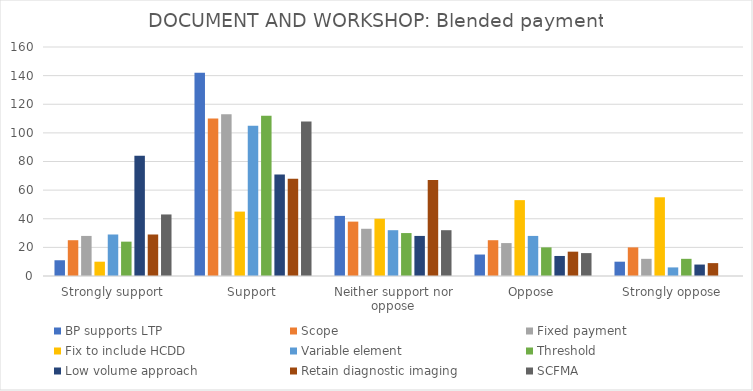
| Category | BP supports LTP | Scope | Fixed payment | Fix to include HCDD | Variable element | Threshold | Low volume approach | Retain diagnostic imaging | SCFMA |
|---|---|---|---|---|---|---|---|---|---|
| Strongly support | 11 | 25 | 28 | 10 | 29 | 24 | 84 | 29 | 43 |
| Support | 142 | 110 | 113 | 45 | 105 | 112 | 71 | 68 | 108 |
| Neither support nor oppose | 42 | 38 | 33 | 40 | 32 | 30 | 28 | 67 | 32 |
| Oppose | 15 | 25 | 23 | 53 | 28 | 20 | 14 | 17 | 16 |
| Strongly oppose | 10 | 20 | 12 | 55 | 6 | 12 | 8 | 9 | 0 |